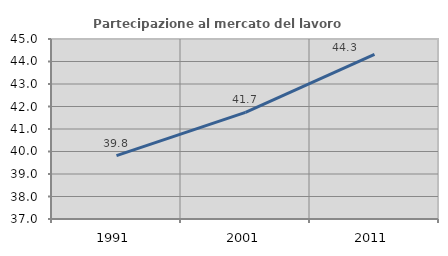
| Category | Partecipazione al mercato del lavoro  femminile |
|---|---|
| 1991.0 | 39.818 |
| 2001.0 | 41.736 |
| 2011.0 | 44.315 |